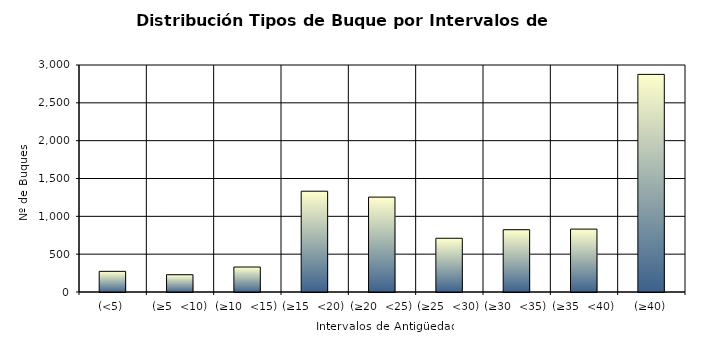
| Category | Series 0 |
|---|---|
| (<5) | 273 |
| (≥5  <10) | 228 |
| (≥10  <15) | 330 |
| (≥15  <20) | 1332 |
| (≥20  <25) | 1254 |
| (≥25  <30) | 710 |
| (≥30  <35) | 823 |
| (≥35  <40) | 831 |
| (≥40) | 2876 |